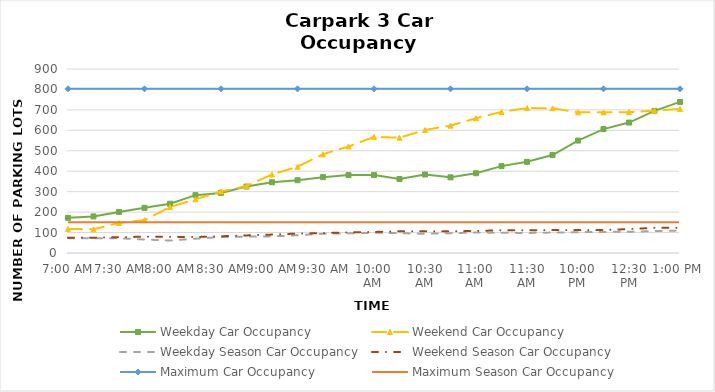
| Category | Weekday Car Occupancy | Weekend Car Occupancy | Weekday Season Car Occupancy | Weekend Season Car Occupancy | Maximum Car Occupancy | Maximum Season Car Occupancy |
|---|---|---|---|---|---|---|
| 0.291666666666666 | 172 | 118 | 72 | 75 | 803 | 151 |
| 0.302083333333333 | 179 | 116 | 72 | 75 | 803 | 151 |
| 0.3125 | 201 | 147 | 72 | 77 | 803 | 151 |
| 0.322916666666667 | 221 | 161 | 66 | 80 | 803 | 151 |
| 0.333333333333333 | 241 | 225 | 61 | 79 | 803 | 151 |
| 0.34375 | 283 | 263 | 70 | 78 | 803 | 151 |
| 0.354166666666667 | 294 | 301 | 78 | 82 | 803 | 151 |
| 0.364583333333333 | 325 | 328 | 80 | 86 | 803 | 151 |
| 0.375 | 346 | 384 | 81 | 90 | 803 | 151 |
| 0.385416666666667 | 356 | 422 | 87 | 95 | 803 | 151 |
| 0.395833333333333 | 371 | 483 | 94 | 97 | 803 | 151 |
| 0.40625 | 381 | 521 | 96 | 101 | 803 | 151 |
| 0.416666666666667 | 381 | 568 | 99 | 103 | 803 | 151 |
| 0.427083333333333 | 362 | 564 | 97 | 106 | 803 | 151 |
| 0.4375 | 384 | 602 | 94 | 106 | 803 | 151 |
| 0.447916666666667 | 370 | 623 | 97 | 106 | 803 | 151 |
| 0.458333333333333 | 390 | 659 | 100 | 108 | 803 | 151 |
| 0.46875 | 425 | 690 | 99 | 111 | 803 | 151 |
| 0.479166666666667 | 446 | 709 | 98 | 111 | 803 | 151 |
| 0.489583333333333 | 479 | 708 | 100 | 112 | 803 | 151 |
| 0.5 | 550 | 688 | 102 | 112 | 803 | 151 |
| 0.510416666666667 | 606 | 688 | 103 | 112 | 803 | 151 |
| 0.520833333333333 | 638 | 689 | 104 | 117 | 803 | 151 |
| 0.53125 | 695 | 696 | 107 | 123 | 803 | 151 |
| 0.541666666666667 | 739 | 705 | 110 | 123 | 803 | 151 |